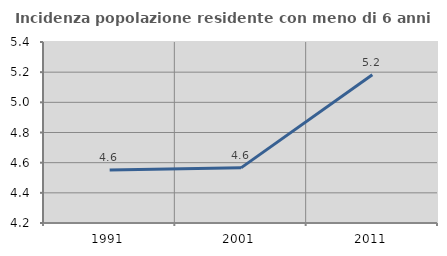
| Category | Incidenza popolazione residente con meno di 6 anni |
|---|---|
| 1991.0 | 4.551 |
| 2001.0 | 4.566 |
| 2011.0 | 5.183 |